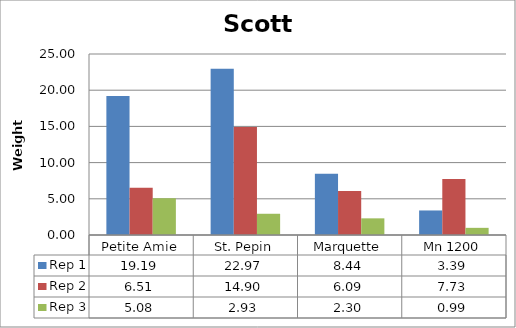
| Category | Rep 1 | Rep 2 | Rep 3 |
|---|---|---|---|
| 0 | 19.189 | 6.511 | 5.078 |
| 1 | 22.967 | 14.9 | 2.933 |
| 2 | 8.444 | 6.089 | 2.3 |
| 3 | 3.389 | 7.733 | 0.989 |